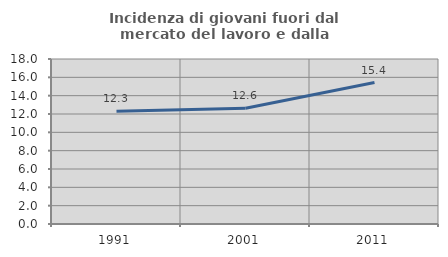
| Category | Incidenza di giovani fuori dal mercato del lavoro e dalla formazione  |
|---|---|
| 1991.0 | 12.298 |
| 2001.0 | 12.636 |
| 2011.0 | 15.431 |